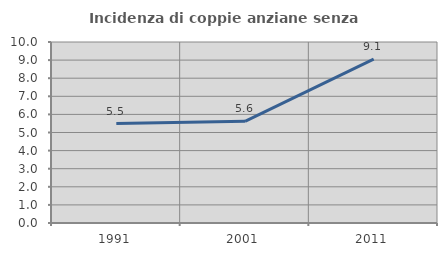
| Category | Incidenza di coppie anziane senza figli  |
|---|---|
| 1991.0 | 5.493 |
| 2001.0 | 5.619 |
| 2011.0 | 9.052 |